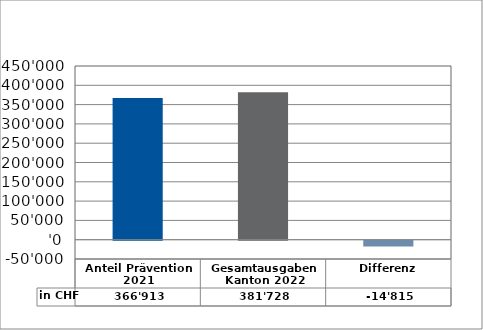
| Category | in CHF |
|---|---|
| Anteil Prävention 2021

 | 366913.35 |
| Gesamtausgaben Kanton 2022
 | 381728.35 |
| Differenz | -14815 |